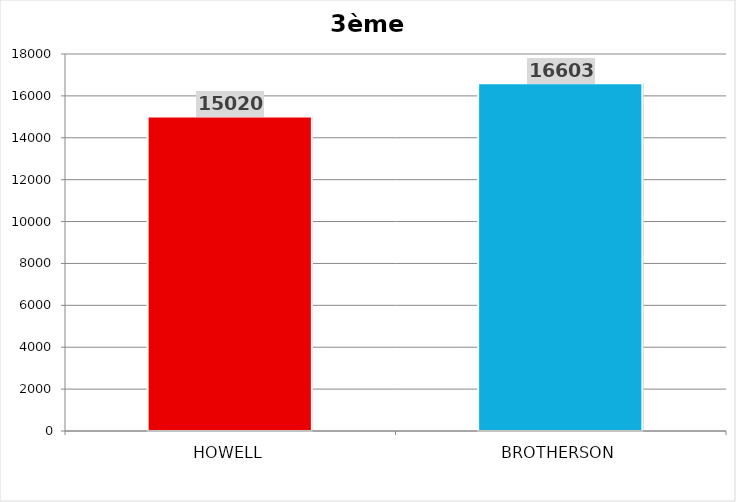
| Category | Series 0 |
|---|---|
| HOWELL | 15020 |
| BROTHERSON | 16603 |